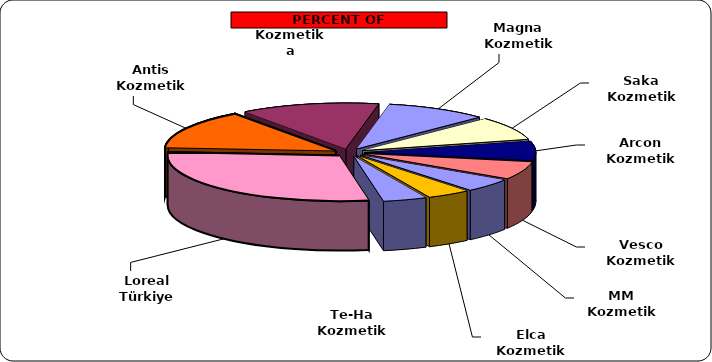
| Category | Series 0 |
|---|---|
| Loreal Türkiye | 42 |
| Antis Kozmetik | 20 |
| Kozmetika | 19 |
| Magna Kozmetik | 14 |
| Saka Kozmetik | 12 |
| Arcon Kozmetik | 10 |
| Vesco Kozmetik | 9 |
| MM Kozmetik | 7 |
| Elca Kozmetik | 6 |
| Te-Ha Kozmetik | 6 |